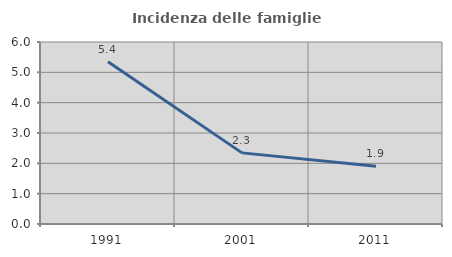
| Category | Incidenza delle famiglie numerose |
|---|---|
| 1991.0 | 5.351 |
| 2001.0 | 2.345 |
| 2011.0 | 1.902 |